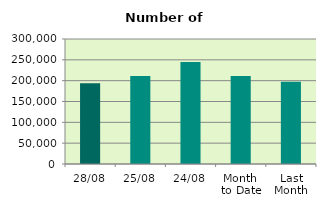
| Category | Series 0 |
|---|---|
| 28/08 | 194000 |
| 25/08 | 210946 |
| 24/08 | 244686 |
| Month 
to Date | 211298.6 |
| Last
Month | 197154 |